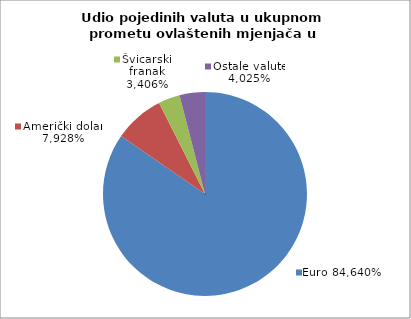
| Category | EUR |
|---|---|
| 0 | 0.846 |
| 1 | 0.079 |
| 2 | 0.034 |
| 3 | 0.04 |